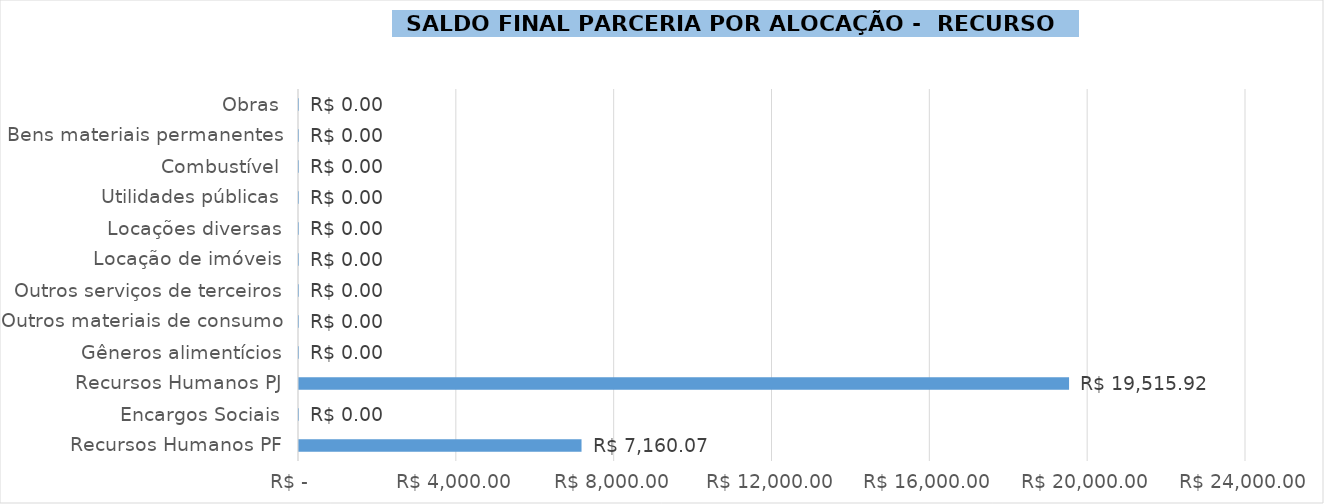
| Category | Saldo Final 2022 |
|---|---|
| Recursos Humanos PF | 7160.069 |
| Encargos Sociais | 0 |
| Recursos Humanos PJ | 19515.921 |
| Gêneros alimentícios | 0 |
| Outros materiais de consumo | 0 |
| Outros serviços de terceiros | 0 |
| Locação de imóveis | 0 |
| Locações diversas | 0 |
| Utilidades públicas | 0 |
| Combustível | 0 |
| Bens materiais permanentes | 0 |
| Obras | 0 |